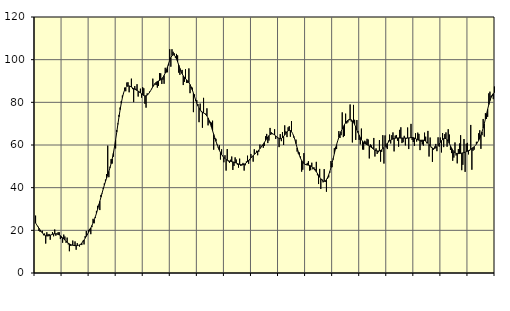
| Category | Piggar | Series 1 |
|---|---|---|
| nan | 26.9 | 23.46 |
| 87.0 | 22.6 | 22.57 |
| 87.0 | 22 | 21.8 |
| 87.0 | 19.7 | 20.97 |
| 87.0 | 19.3 | 20.18 |
| 87.0 | 19.3 | 19.44 |
| 87.0 | 19.8 | 18.79 |
| 87.0 | 17.7 | 18.21 |
| 87.0 | 18.5 | 17.77 |
| 87.0 | 13.8 | 17.49 |
| 87.0 | 19.1 | 17.36 |
| 87.0 | 18.1 | 17.37 |
| nan | 18.3 | 17.5 |
| 88.0 | 15.6 | 17.69 |
| 88.0 | 17.8 | 17.93 |
| 88.0 | 19.2 | 18.15 |
| 88.0 | 17.2 | 18.32 |
| 88.0 | 20.4 | 18.4 |
| 88.0 | 17.5 | 18.38 |
| 88.0 | 18.5 | 18.27 |
| 88.0 | 19.1 | 18.09 |
| 88.0 | 19.1 | 17.83 |
| 88.0 | 15.9 | 17.49 |
| 88.0 | 16.4 | 17.04 |
| nan | 14.2 | 16.52 |
| 89.0 | 18 | 15.97 |
| 89.0 | 17.1 | 15.43 |
| 89.0 | 14.2 | 14.9 |
| 89.0 | 16.6 | 14.42 |
| 89.0 | 13.4 | 14.01 |
| 89.0 | 10.2 | 13.66 |
| 89.0 | 12.8 | 13.39 |
| 89.0 | 12.9 | 13.17 |
| 89.0 | 15.2 | 13.02 |
| 89.0 | 12.7 | 12.9 |
| 89.0 | 14.8 | 12.83 |
| nan | 10.9 | 12.81 |
| 90.0 | 14 | 12.85 |
| 90.0 | 13 | 12.97 |
| 90.0 | 12.4 | 13.19 |
| 90.0 | 13.3 | 13.55 |
| 90.0 | 13.1 | 14.04 |
| 90.0 | 15.1 | 14.7 |
| 90.0 | 13.4 | 15.47 |
| 90.0 | 17.3 | 16.32 |
| 90.0 | 19.7 | 17.2 |
| 90.0 | 17.8 | 18.12 |
| 90.0 | 20.2 | 19.07 |
| nan | 20.7 | 20.08 |
| 91.0 | 18.2 | 21.14 |
| 91.0 | 21.5 | 22.27 |
| 91.0 | 25.4 | 23.49 |
| 91.0 | 23.3 | 24.84 |
| 91.0 | 25.8 | 26.32 |
| 91.0 | 29.1 | 27.97 |
| 91.0 | 31.5 | 29.77 |
| 91.0 | 32 | 31.67 |
| 91.0 | 29.5 | 33.61 |
| 91.0 | 36.6 | 35.56 |
| 91.0 | 37.3 | 37.48 |
| nan | 39.8 | 39.36 |
| 92.0 | 42 | 41.16 |
| 92.0 | 43.8 | 42.87 |
| 92.0 | 46.4 | 44.49 |
| 92.0 | 59.7 | 46.05 |
| 92.0 | 44.9 | 47.64 |
| 92.0 | 49.8 | 49.34 |
| 92.0 | 53.4 | 51.27 |
| 92.0 | 51.3 | 53.5 |
| 92.0 | 54.5 | 56.12 |
| 92.0 | 59.3 | 59.14 |
| 92.0 | 58.4 | 62.46 |
| nan | 67 | 66.01 |
| 93.0 | 70.1 | 69.65 |
| 93.0 | 74.1 | 73.21 |
| 93.0 | 77.6 | 76.55 |
| 93.0 | 80.6 | 79.57 |
| 93.0 | 83.2 | 82.17 |
| 93.0 | 84 | 84.28 |
| 93.0 | 86.9 | 85.83 |
| 93.0 | 85.2 | 86.86 |
| 93.0 | 89.3 | 87.46 |
| 93.0 | 89.4 | 87.71 |
| 93.0 | 84.7 | 87.69 |
| nan | 87.3 | 87.49 |
| 94.0 | 91.1 | 87.15 |
| 94.0 | 86.2 | 86.77 |
| 94.0 | 80.1 | 86.42 |
| 94.0 | 87.6 | 86.12 |
| 94.0 | 86.4 | 85.85 |
| 94.0 | 88.5 | 85.58 |
| 94.0 | 82.7 | 85.27 |
| 94.0 | 84.6 | 84.91 |
| 94.0 | 86.4 | 84.48 |
| 94.0 | 82.2 | 84 |
| 94.0 | 87.1 | 83.54 |
| nan | 86.6 | 83.19 |
| 95.0 | 79.3 | 83.01 |
| 95.0 | 77.5 | 83.04 |
| 95.0 | 84.2 | 83.34 |
| 95.0 | 83.9 | 83.87 |
| 95.0 | 85 | 84.57 |
| 95.0 | 85.4 | 85.42 |
| 95.0 | 86.2 | 86.36 |
| 95.0 | 91.1 | 87.31 |
| 95.0 | 88 | 88.17 |
| 95.0 | 88.3 | 88.87 |
| 95.0 | 88.1 | 89.41 |
| nan | 86.9 | 89.75 |
| 96.0 | 87.7 | 90.01 |
| 96.0 | 93.7 | 90.27 |
| 96.0 | 93.6 | 90.6 |
| 96.0 | 88.6 | 91.05 |
| 96.0 | 90.6 | 91.71 |
| 96.0 | 88.7 | 92.6 |
| 96.0 | 96.2 | 93.72 |
| 96.0 | 94 | 95.07 |
| 96.0 | 94.1 | 96.58 |
| 96.0 | 97.3 | 98.18 |
| 96.0 | 104.9 | 99.68 |
| nan | 96.7 | 100.97 |
| 97.0 | 104.9 | 101.88 |
| 97.0 | 103.7 | 102.29 |
| 97.0 | 103 | 102.13 |
| 97.0 | 101 | 101.47 |
| 97.0 | 102.7 | 100.37 |
| 97.0 | 102 | 98.98 |
| 97.0 | 93.9 | 97.46 |
| 97.0 | 92.9 | 95.94 |
| 97.0 | 94.8 | 94.57 |
| 97.0 | 95.2 | 93.4 |
| 97.0 | 88.1 | 92.44 |
| nan | 89.6 | 91.69 |
| 98.0 | 95.5 | 91.07 |
| 98.0 | 89.1 | 90.53 |
| 98.0 | 89.1 | 89.95 |
| 98.0 | 95.9 | 89.23 |
| 98.0 | 84.3 | 88.35 |
| 98.0 | 86.6 | 87.21 |
| 98.0 | 86.9 | 85.85 |
| 98.0 | 75.4 | 84.32 |
| 98.0 | 83.7 | 82.69 |
| 98.0 | 80.7 | 81.08 |
| 98.0 | 81 | 79.59 |
| nan | 79.2 | 78.33 |
| 99.0 | 70.7 | 77.29 |
| 99.0 | 79.4 | 76.44 |
| 99.0 | 75.4 | 75.83 |
| 99.0 | 68.1 | 75.39 |
| 99.0 | 82.1 | 75.04 |
| 99.0 | 74.6 | 74.71 |
| 99.0 | 74.7 | 74.26 |
| 99.0 | 77.2 | 73.59 |
| 99.0 | 69.2 | 72.66 |
| 99.0 | 70.6 | 71.46 |
| 99.0 | 70.9 | 70.02 |
| nan | 70.5 | 68.4 |
| 0.0 | 71.4 | 66.69 |
| 0.0 | 57.8 | 64.99 |
| 0.0 | 62.8 | 63.31 |
| 0.0 | 62.9 | 61.72 |
| 0.0 | 60 | 60.23 |
| 0.0 | 58.6 | 58.83 |
| 0.0 | 59.9 | 57.57 |
| 0.0 | 53.2 | 56.46 |
| 0.0 | 58 | 55.54 |
| 0.0 | 55 | 54.79 |
| 0.0 | 51.9 | 54.17 |
| nan | 55.2 | 53.63 |
| 1.0 | 48 | 53.19 |
| 1.0 | 58.1 | 52.86 |
| 1.0 | 52.3 | 52.63 |
| 1.0 | 51.6 | 52.45 |
| 1.0 | 53.1 | 52.31 |
| 1.0 | 54.6 | 52.18 |
| 1.0 | 48.3 | 52.07 |
| 1.0 | 50.2 | 51.93 |
| 1.0 | 54.2 | 51.76 |
| 1.0 | 53.2 | 51.54 |
| 1.0 | 50.8 | 51.32 |
| nan | 49.4 | 51.11 |
| 2.0 | 53.6 | 50.93 |
| 2.0 | 50.2 | 50.82 |
| 2.0 | 50.4 | 50.77 |
| 2.0 | 51.6 | 50.82 |
| 2.0 | 48 | 50.98 |
| 2.0 | 50.5 | 51.26 |
| 2.0 | 52.3 | 51.67 |
| 2.0 | 55 | 52.2 |
| 2.0 | 51.2 | 52.78 |
| 2.0 | 52.8 | 53.36 |
| 2.0 | 55.8 | 53.94 |
| nan | 54.4 | 54.52 |
| 3.0 | 52.2 | 55.07 |
| 3.0 | 58 | 55.57 |
| 3.0 | 56.3 | 56.05 |
| 3.0 | 57.3 | 56.56 |
| 3.0 | 55.2 | 57.09 |
| 3.0 | 56.8 | 57.67 |
| 3.0 | 60.2 | 58.29 |
| 3.0 | 58.9 | 58.95 |
| 3.0 | 60 | 59.65 |
| 3.0 | 58.7 | 60.42 |
| 3.0 | 59.6 | 61.24 |
| nan | 64.1 | 62.09 |
| 4.0 | 65.2 | 62.95 |
| 4.0 | 60.9 | 63.75 |
| 4.0 | 62.1 | 64.42 |
| 4.0 | 68 | 64.89 |
| 4.0 | 66 | 65.16 |
| 4.0 | 65.5 | 65.21 |
| 4.0 | 65.1 | 65.05 |
| 4.0 | 67.4 | 64.71 |
| 4.0 | 62.8 | 64.26 |
| 4.0 | 63.7 | 63.78 |
| 4.0 | 63.2 | 63.36 |
| nan | 59 | 63.06 |
| 5.0 | 65.1 | 62.94 |
| 5.0 | 61.8 | 63.06 |
| 5.0 | 66.1 | 63.44 |
| 5.0 | 60 | 64.03 |
| 5.0 | 69.2 | 64.73 |
| 5.0 | 66.4 | 65.49 |
| 5.0 | 63.7 | 66.17 |
| 5.0 | 68.3 | 66.66 |
| 5.0 | 68.8 | 66.88 |
| 5.0 | 63.9 | 66.79 |
| 5.0 | 71.2 | 66.3 |
| nan | 65.4 | 65.39 |
| 6.0 | 63.5 | 64.09 |
| 6.0 | 62.5 | 62.45 |
| 6.0 | 62.5 | 60.59 |
| 6.0 | 56.9 | 58.67 |
| 6.0 | 56 | 56.84 |
| 6.0 | 56.5 | 55.2 |
| 6.0 | 54.6 | 53.81 |
| 6.0 | 47.5 | 52.73 |
| 6.0 | 48.4 | 51.92 |
| 6.0 | 56.2 | 51.35 |
| 6.0 | 50.9 | 50.97 |
| nan | 51.1 | 50.75 |
| 7.0 | 51.6 | 50.62 |
| 7.0 | 52.4 | 50.53 |
| 7.0 | 48 | 50.43 |
| 7.0 | 48.2 | 50.24 |
| 7.0 | 51.7 | 49.92 |
| 7.0 | 48.6 | 49.44 |
| 7.0 | 49.5 | 48.84 |
| 7.0 | 48.7 | 48.16 |
| 7.0 | 52.1 | 47.45 |
| 7.0 | 45.8 | 46.67 |
| 7.0 | 41.7 | 45.82 |
| nan | 48.8 | 44.97 |
| 8.0 | 39.4 | 44.19 |
| 8.0 | 44 | 43.54 |
| 8.0 | 42.5 | 43.1 |
| 8.0 | 48.7 | 42.97 |
| 8.0 | 42.7 | 43.2 |
| 8.0 | 38.1 | 43.79 |
| 8.0 | 44.2 | 44.74 |
| 8.0 | 44.8 | 46.04 |
| 8.0 | 47 | 47.62 |
| 8.0 | 52.5 | 49.44 |
| 8.0 | 49.6 | 51.51 |
| nan | 53.2 | 53.72 |
| 9.0 | 58.5 | 55.96 |
| 9.0 | 59.1 | 58.15 |
| 9.0 | 58.1 | 60.19 |
| 9.0 | 62 | 61.99 |
| 9.0 | 66.5 | 63.56 |
| 9.0 | 63.3 | 65.01 |
| 9.0 | 64.6 | 66.34 |
| 9.0 | 75.3 | 67.53 |
| 9.0 | 63.7 | 68.61 |
| 9.0 | 64.3 | 69.56 |
| 9.0 | 74.7 | 70.38 |
| nan | 70.1 | 71.06 |
| 10.0 | 70.6 | 71.59 |
| 10.0 | 71.6 | 71.89 |
| 10.0 | 79 | 71.96 |
| 10.0 | 71 | 71.8 |
| 10.0 | 61.2 | 71.36 |
| 10.0 | 78.8 | 70.63 |
| 10.0 | 71.8 | 69.63 |
| 10.0 | 62.4 | 68.4 |
| 10.0 | 71.7 | 67.07 |
| 10.0 | 66.6 | 65.78 |
| 10.0 | 62.4 | 64.57 |
| nan | 60.3 | 63.48 |
| 11.0 | 67.7 | 62.54 |
| 11.0 | 57.9 | 61.78 |
| 11.0 | 57.8 | 61.19 |
| 11.0 | 62 | 60.74 |
| 11.0 | 61.6 | 60.43 |
| 11.0 | 62.9 | 60.17 |
| 11.0 | 62.6 | 59.88 |
| 11.0 | 53.7 | 59.57 |
| 11.0 | 60.3 | 59.2 |
| 11.0 | 59.8 | 58.79 |
| 11.0 | 58.8 | 58.36 |
| nan | 63.3 | 57.95 |
| 12.0 | 54.6 | 57.6 |
| 12.0 | 58.4 | 57.35 |
| 12.0 | 55.8 | 57.21 |
| 12.0 | 56.6 | 57.2 |
| 12.0 | 62.3 | 57.29 |
| 12.0 | 52.2 | 57.46 |
| 12.0 | 56.8 | 57.77 |
| 12.0 | 64.6 | 58.22 |
| 12.0 | 51.3 | 58.81 |
| 12.0 | 64.5 | 59.45 |
| 12.0 | 58.8 | 60.13 |
| nan | 58.1 | 60.8 |
| 13.0 | 62.1 | 61.38 |
| 13.0 | 64.9 | 61.88 |
| 13.0 | 60.7 | 62.29 |
| 13.0 | 64.6 | 62.61 |
| 13.0 | 65.9 | 62.86 |
| 13.0 | 57 | 63.05 |
| 13.0 | 64.4 | 63.19 |
| 13.0 | 64.7 | 63.27 |
| 13.0 | 62 | 63.31 |
| 13.0 | 59.2 | 63.32 |
| 13.0 | 67.1 | 63.27 |
| nan | 68.3 | 63.24 |
| 14.0 | 60.9 | 63.24 |
| 14.0 | 61.3 | 63.25 |
| 14.0 | 64.3 | 63.26 |
| 14.0 | 59.8 | 63.26 |
| 14.0 | 63 | 63.24 |
| 14.0 | 68.2 | 63.25 |
| 14.0 | 58.1 | 63.32 |
| 14.0 | 63.4 | 63.39 |
| 14.0 | 69.9 | 63.48 |
| 14.0 | 62.4 | 63.52 |
| 14.0 | 61.4 | 63.45 |
| nan | 59.6 | 63.26 |
| 15.0 | 65.5 | 62.97 |
| 15.0 | 61.6 | 62.69 |
| 15.0 | 65.8 | 62.45 |
| 15.0 | 65.2 | 62.27 |
| 15.0 | 57.6 | 62.21 |
| 15.0 | 61.5 | 62.23 |
| 15.0 | 60.3 | 62.26 |
| 15.0 | 59.7 | 62.25 |
| 15.0 | 65.8 | 62.11 |
| 15.0 | 63.9 | 61.8 |
| 15.0 | 60.8 | 61.37 |
| nan | 66.6 | 60.82 |
| 16.0 | 54.6 | 60.22 |
| 16.0 | 63.5 | 59.59 |
| 16.0 | 58.7 | 59.04 |
| 16.0 | 52.1 | 58.61 |
| 16.0 | 57.8 | 58.38 |
| 16.0 | 59.3 | 58.42 |
| 16.0 | 60.5 | 58.7 |
| 16.0 | 57.1 | 59.17 |
| 16.0 | 63.6 | 59.78 |
| 16.0 | 59.2 | 60.49 |
| 16.0 | 63.5 | 61.24 |
| nan | 56.5 | 61.99 |
| 17.0 | 65.6 | 62.59 |
| 17.0 | 59 | 62.98 |
| 17.0 | 65.1 | 63.12 |
| 17.0 | 65.9 | 62.97 |
| 17.0 | 59.2 | 62.52 |
| 17.0 | 67.4 | 61.71 |
| 17.0 | 64.9 | 60.69 |
| 17.0 | 57.7 | 59.6 |
| 17.0 | 56.2 | 58.53 |
| 17.0 | 52.6 | 57.6 |
| 17.0 | 54.1 | 56.89 |
| nan | 61.2 | 56.39 |
| 18.0 | 55.1 | 56.1 |
| 18.0 | 51.4 | 55.99 |
| 18.0 | 58.1 | 55.96 |
| 18.0 | 60.7 | 55.99 |
| 18.0 | 64.6 | 56.08 |
| 18.0 | 48.2 | 56.21 |
| 18.0 | 50.7 | 56.32 |
| 18.0 | 62.8 | 56.45 |
| 18.0 | 47.4 | 56.63 |
| 18.0 | 60.6 | 56.84 |
| 18.0 | 61 | 57.07 |
| nan | 55.6 | 57.33 |
| 19.0 | 57.3 | 57.64 |
| 19.0 | 69.4 | 58 |
| 19.0 | 48.4 | 58.39 |
| 19.0 | 57.3 | 58.77 |
| 19.0 | 57.8 | 59.18 |
| 19.0 | 59.7 | 59.7 |
| 19.0 | 61.5 | 60.38 |
| 19.0 | 61.4 | 61.19 |
| 19.0 | 65.5 | 62.14 |
| 19.0 | 66.9 | 63.29 |
| 19.0 | 58.2 | 64.63 |
| nan | 64.6 | 66.2 |
| 20.0 | 72.2 | 68 |
| 20.0 | 63.9 | 70 |
| 20.0 | 74.9 | 72.18 |
| 20.0 | 72.2 | 74.49 |
| 20.0 | 73.2 | 76.79 |
| 20.0 | 84.2 | 78.92 |
| 20.0 | 85 | 80.78 |
| 20.0 | 82.9 | 82.29 |
| 20.0 | 82.9 | 83.4 |
| 20.0 | 81.5 | 84.13 |
| 20.0 | 87.4 | 84.54 |